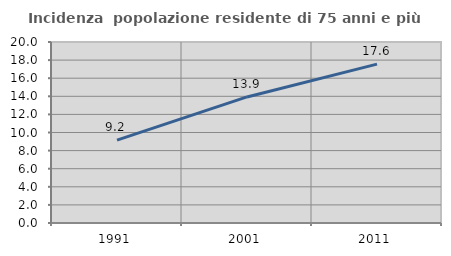
| Category | Incidenza  popolazione residente di 75 anni e più |
|---|---|
| 1991.0 | 9.165 |
| 2001.0 | 13.93 |
| 2011.0 | 17.559 |